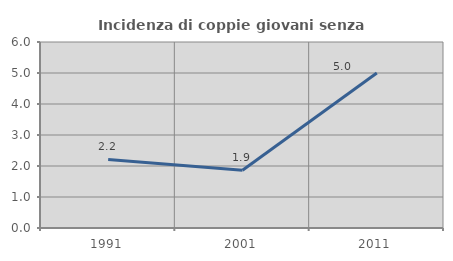
| Category | Incidenza di coppie giovani senza figli |
|---|---|
| 1991.0 | 2.212 |
| 2001.0 | 1.86 |
| 2011.0 | 5 |